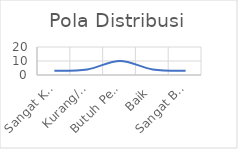
| Category | Pola Distribusi |
|---|---|
| Sangat Kurang | 3 |
| Kurang/Misconduct | 4 |
| Butuh Perbaikan | 10 |
| Baik | 4 |
| Sangat Baik | 3 |